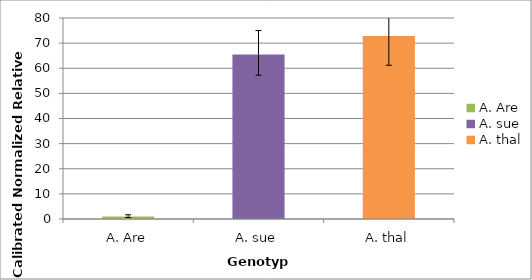
| Category | LDA1 |
|---|---|
| A. Are | 1 |
| A. sue | 65.519 |
| A. thal | 72.794 |